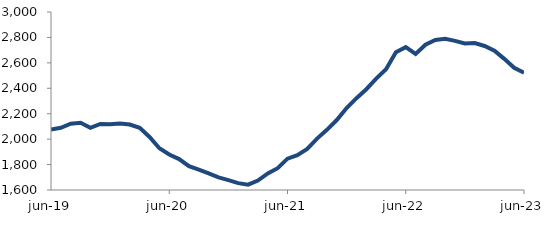
| Category | Series 0 |
|---|---|
| 2019-06-01 | 2076.377 |
| 2019-07-01 | 2089.152 |
| 2019-08-01 | 2121.901 |
| 2019-09-01 | 2128.491 |
| 2019-10-01 | 2088.553 |
| 2019-11-01 | 2119.211 |
| 2019-12-01 | 2116.27 |
| 2020-01-01 | 2123.179 |
| 2020-02-01 | 2115.217 |
| 2020-03-01 | 2088.6 |
| 2020-04-01 | 2017.241 |
| 2020-05-01 | 1928.116 |
| 2020-06-01 | 1878.979 |
| 2020-07-01 | 1843.29 |
| 2020-08-01 | 1787.543 |
| 2020-09-01 | 1760.281 |
| 2020-10-01 | 1731.197 |
| 2020-11-01 | 1698.835 |
| 2020-12-01 | 1677.184 |
| 2021-01-01 | 1654.072 |
| 2021-02-01 | 1641.869 |
| 2021-03-01 | 1673.821 |
| 2021-04-01 | 1730.759 |
| 2021-05-01 | 1771.425 |
| 2021-06-01 | 1846.573 |
| 2021-07-01 | 1874.111 |
| 2021-08-01 | 1922.894 |
| 2021-09-01 | 2004.225 |
| 2021-10-01 | 2073.331 |
| 2021-11-01 | 2150.314 |
| 2021-12-01 | 2244.492 |
| 2022-01-01 | 2321.95 |
| 2022-02-01 | 2392.65 |
| 2022-03-01 | 2476.383 |
| 2022-04-01 | 2549.069 |
| 2022-05-01 | 2683.336 |
| 2022-06-01 | 2723.868 |
| 2022-07-01 | 2670.585 |
| 2022-08-01 | 2742.913 |
| 2022-09-01 | 2780.46 |
| 2022-10-01 | 2788.916 |
| 2022-11-01 | 2772.628 |
| 2022-12-01 | 2752.307 |
| 2023-01-01 | 2755.69 |
| 2023-02-01 | 2732.653 |
| 2023-03-01 | 2696.107 |
| 2023-04-01 | 2631.454 |
| 2023-05-01 | 2561.826 |
| 2023-06-01 | 2522.703 |